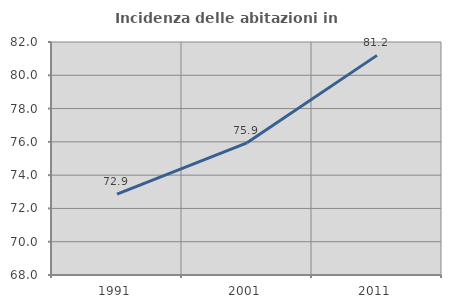
| Category | Incidenza delle abitazioni in proprietà  |
|---|---|
| 1991.0 | 72.857 |
| 2001.0 | 75.94 |
| 2011.0 | 81.197 |